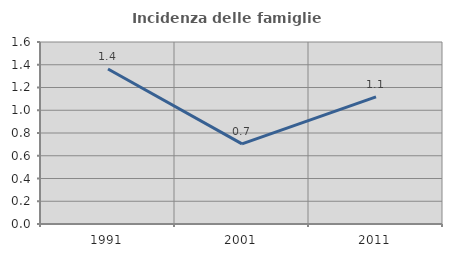
| Category | Incidenza delle famiglie numerose |
|---|---|
| 1991.0 | 1.362 |
| 2001.0 | 0.704 |
| 2011.0 | 1.118 |